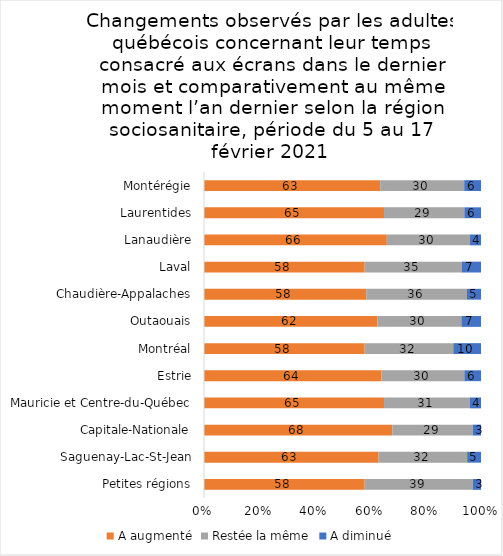
| Category | A augmenté | Restée la même | A diminué |
|---|---|---|---|
| Petites régions | 58 | 39 | 3 |
| Saguenay-Lac-St-Jean | 63 | 32 | 5 |
| Capitale-Nationale | 68 | 29 | 3 |
| Mauricie et Centre-du-Québec | 65 | 31 | 4 |
| Estrie | 64 | 30 | 6 |
| Montréal | 58 | 32 | 10 |
| Outaouais | 62 | 30 | 7 |
| Chaudière-Appalaches | 58 | 36 | 5 |
| Laval | 58 | 35 | 7 |
| Lanaudière | 66 | 30 | 4 |
| Laurentides | 65 | 29 | 6 |
| Montérégie | 63 | 30 | 6 |